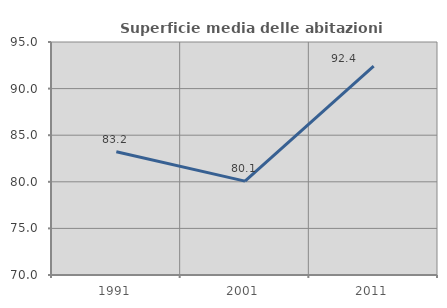
| Category | Superficie media delle abitazioni occupate |
|---|---|
| 1991.0 | 83.221 |
| 2001.0 | 80.075 |
| 2011.0 | 92.402 |